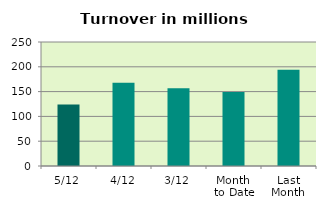
| Category | Series 0 |
|---|---|
| 5/12 | 123.804 |
| 4/12 | 167.839 |
| 3/12 | 156.692 |
| Month 
to Date | 149.445 |
| Last
Month | 193.997 |